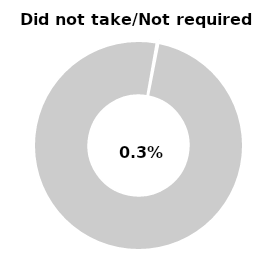
| Category | Series 0 |
|---|---|
| Did not take/not required | 0.003 |
| Other | 0.997 |